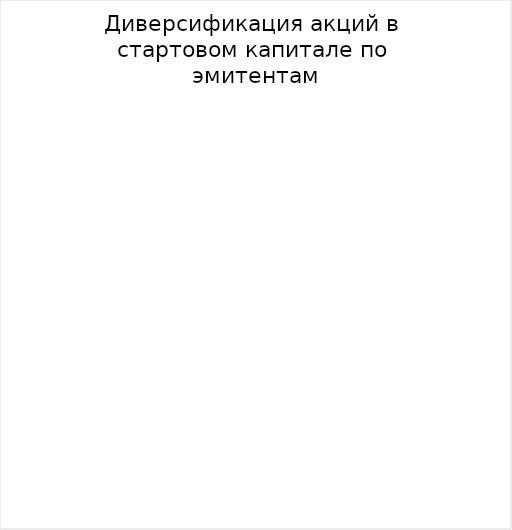
| Category | 1 |
|---|---|
|  | 0 |
|  | 0 |
|  | 0 |
|  | 0 |
|  | 0 |
|  | 0 |
|  | 0 |
|  | 0 |
|  | 0 |
|  | 0 |
|  | 0 |
|  | 0 |
|  | 0 |
|  | 0 |
|  | 0 |
|  | 0 |
|  | 0 |
|  | 0 |
|  | 0 |
|  | 0 |
|  | 0 |
|  | 0 |
|  | 0 |
|  | 0 |
|  | 0 |
|  | 0 |
|  | 0 |
|  | 0 |
|  | 0 |
|  | 0 |
|  | 0 |
|  | 0 |
|  | 0 |
|  | 0 |
|  | 0 |
|  | 0 |
|  | 0 |
|  | 0 |
|  | 0 |
|  | 0 |
|  | 0 |
|  | 0 |
|  | 0 |
|  | 0 |
|  | 0 |
|  | 0 |
|  | 0 |
|  | 0 |
|  | 0 |
|  | 0 |
|  | 0 |
|  | 0 |
|  | 0 |
|  | 0 |
|  | 0 |